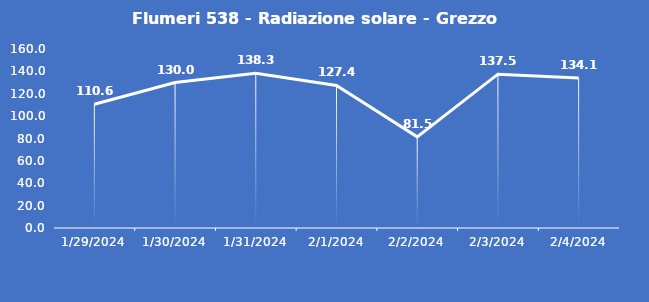
| Category | Flumeri 538 - Radiazione solare - Grezzo (W/m2) |
|---|---|
| 1/29/24 | 110.6 |
| 1/30/24 | 130 |
| 1/31/24 | 138.3 |
| 2/1/24 | 127.4 |
| 2/2/24 | 81.5 |
| 2/3/24 | 137.5 |
| 2/4/24 | 134.1 |